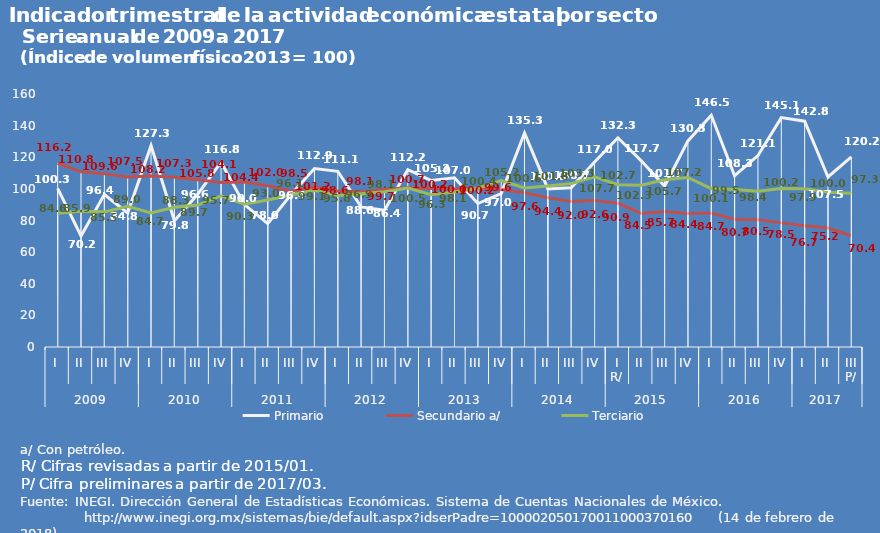
| Category | Primario | Secundario a/ | Terciario |
|---|---|---|---|
| 0 | 100.285 | 116.205 | 84.591 |
| 1 | 70.196 | 110.776 | 85.852 |
| 2 | 96.361 | 109.59 | 85.457 |
| 3 | 84.765 | 107.517 | 88.959 |
| 4 | 127.332 | 108.167 | 84.714 |
| 5 | 79.828 | 107.278 | 88.334 |
| 6 | 96.597 | 105.771 | 89.74 |
| 7 | 116.846 | 104.106 | 95.662 |
| 8 | 90.048 | 104.381 | 90.283 |
| 9 | 78.034 | 102.025 | 93.002 |
| 10 | 96.396 | 98.49 | 96.126 |
| 11 | 112.906 | 101.182 | 99.073 |
| 12 | 111.116 | 98.581 | 95.807 |
| 13 | 88.609 | 98.119 | 96.864 |
| 14 | 86.45 | 99.676 | 98.145 |
| 15 | 112.182 | 100.732 | 100.523 |
| 16 | 105.255 | 100.247 | 96.286 |
| 17 | 106.995 | 99.979 | 98.077 |
| 18 | 90.743 | 100.215 | 100.409 |
| 19 | 97.007 | 99.559 | 105.228 |
| 20 | 135.318 | 97.6 | 100.579 |
| 21 | 99.971 | 94.421 | 101.778 |
| 22 | 100.68 | 92.009 | 103.343 |
| 23 | 116.96 | 92.619 | 107.688 |
| 24 | 132.302 | 90.891 | 102.651 |
| 25 | 117.735 | 84.496 | 102.271 |
| 26 | 101.741 | 85.747 | 105.728 |
| 27 | 130.328 | 84.435 | 107.186 |
| 28 | 146.524 | 84.676 | 100.115 |
| 29 | 108.332 | 80.741 | 99.545 |
| 30 | 121.081 | 80.481 | 98.435 |
| 31 | 145.056 | 78.497 | 100.24 |
| 32 | 142.783 | 76.679 | 100.048 |
| 33 | 107.537 | 75.243 | 97.922 |
| 34 | 120.23 | 70.372 | 97.258 |